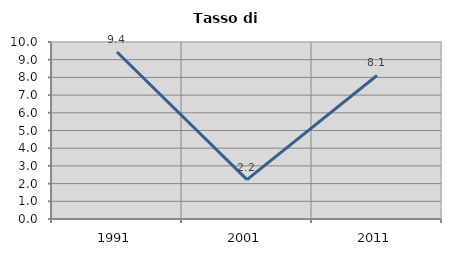
| Category | Tasso di disoccupazione   |
|---|---|
| 1991.0 | 9.434 |
| 2001.0 | 2.222 |
| 2011.0 | 8.108 |